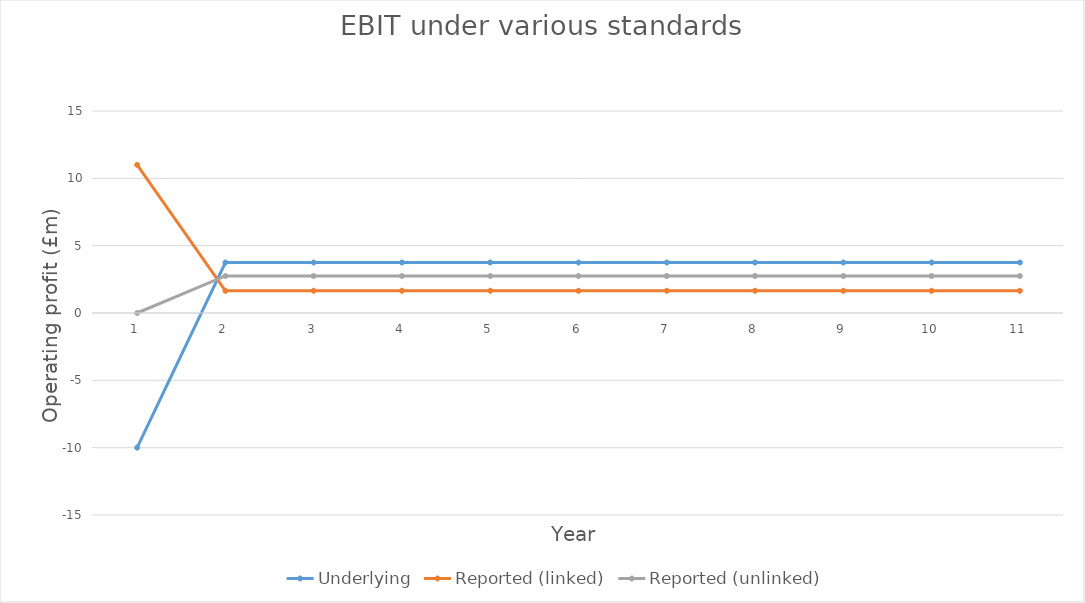
| Category | Underlying | Reported (linked) | Reported (unlinked) |
|---|---|---|---|
| 0 | -10 | 11 | 0 |
| 1 | 3.75 | 1.65 | 2.75 |
| 2 | 3.75 | 1.65 | 2.75 |
| 3 | 3.75 | 1.65 | 2.75 |
| 4 | 3.75 | 1.65 | 2.75 |
| 5 | 3.75 | 1.65 | 2.75 |
| 6 | 3.75 | 1.65 | 2.75 |
| 7 | 3.75 | 1.65 | 2.75 |
| 8 | 3.75 | 1.65 | 2.75 |
| 9 | 3.75 | 1.65 | 2.75 |
| 10 | 3.75 | 1.65 | 2.75 |